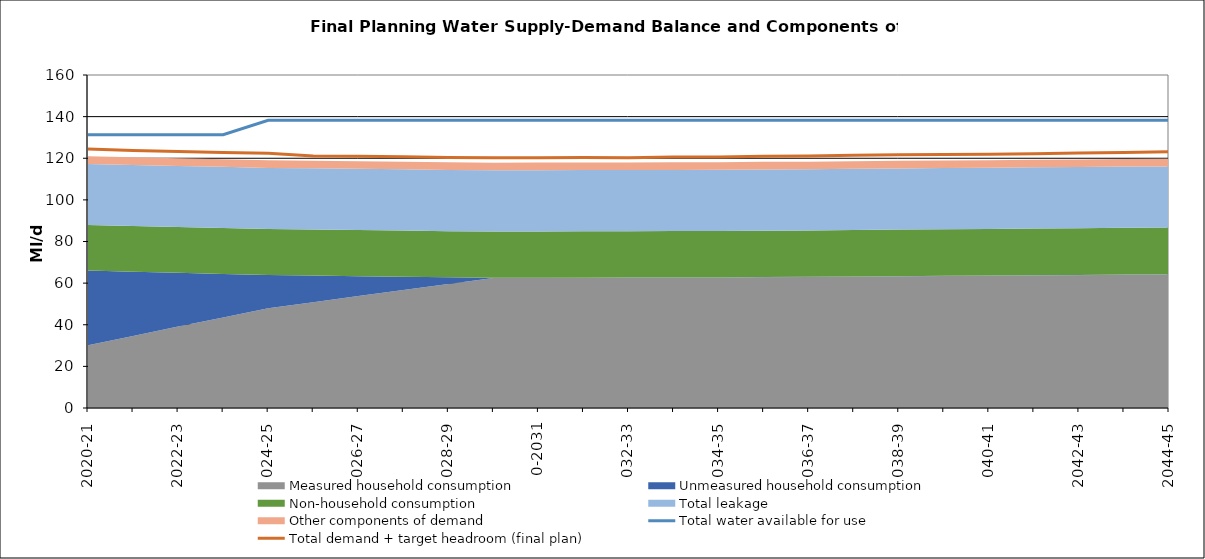
| Category | Total water available for use | Total demand + target headroom (final plan) |
|---|---|---|
| 0 | 131.269 | 124.393 |
| 1 | 131.269 | 123.754 |
| 2 | 131.269 | 123.243 |
| 3 | 131.269 | 122.757 |
| 4 | 138.269 | 122.355 |
| 5 | 138.269 | 121.105 |
| 6 | 138.269 | 120.927 |
| 7 | 138.269 | 120.686 |
| 8 | 138.269 | 120.403 |
| 9 | 138.269 | 120.252 |
| 10 | 138.269 | 120.29 |
| 11 | 138.269 | 120.382 |
| 12 | 138.269 | 120.276 |
| 13 | 138.269 | 120.579 |
| 14 | 138.269 | 120.644 |
| 15 | 138.269 | 120.962 |
| 16 | 138.269 | 121.068 |
| 17 | 138.269 | 121.405 |
| 18 | 138.269 | 121.741 |
| 19 | 138.269 | 121.855 |
| 20 | 138.269 | 121.948 |
| 21 | 138.269 | 122.16 |
| 22 | 138.269 | 122.487 |
| 23 | 138.269 | 122.732 |
| 24 | 138.269 | 123.125 |